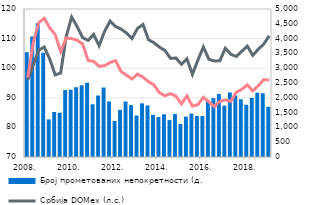
| Category | Број прометованих непокретности (д.с.)  |
|---|---|
| 2008. | 3540 |
| II | 4071 |
| III | 4515 |
| IV | 3524 |
| 2009. | 1271 |
| II | 1521 |
| III | 1495 |
| IV | 2262 |
| 2010. | 2272 |
| II | 2357 |
| III | 2422 |
| IV | 2508 |
| 2011. | 1782 |
| II | 2078 |
| III | 2347 |
| IV | 1877 |
| 2012. | 1218 |
| II | 1592 |
| III | 1875 |
| IV | 1752 |
| 2013. | 1403 |
| II | 1813 |
| III | 1741 |
| IV | 1424 |
| 2014. | 1351 |
| II | 1443 |
| III | 1247 |
| IV | 1451 |
| 2015. | 1113 |
| II | 1363 |
| III | 1466 |
| IV | 1385 |
| 2016. | 1384 |
| II | 1897 |
| III | 1989 |
| IV | 2128 |
| 2017. | 1735 |
| II | 2181 |
| III | 2081 |
| IV | 1948 |
| 2018. | 1765 |
| II | 1999 |
| III | 2171 |
| IV | 2154 |
| 2019. | 1697 |